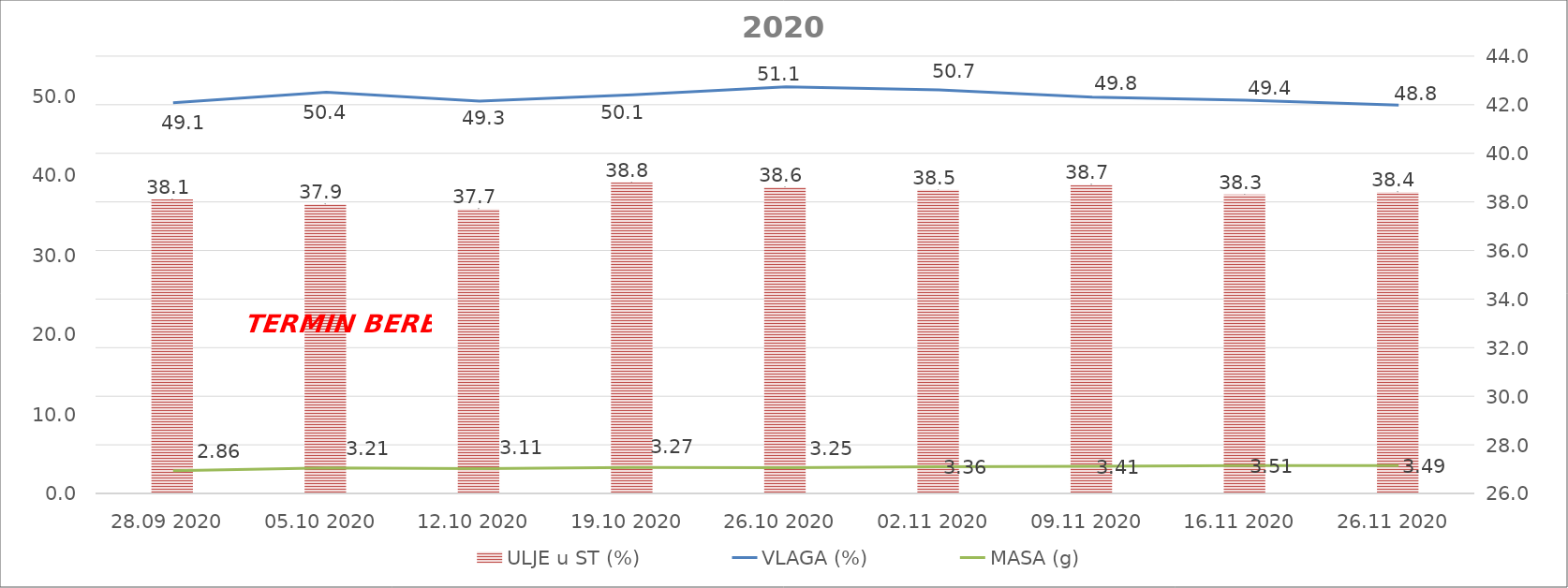
| Category | ULJE u ST (%) |
|---|---|
| 28.09 2020 | 38.1 |
| 05.10 2020 | 37.9 |
| 12.10 2020 | 37.7 |
| 19.10 2020 | 38.8 |
| 26.10 2020 | 38.6 |
| 02.11 2020 | 38.5 |
| 09.11 2020 | 38.7 |
| 16.11 2020 | 38.3 |
| 26.11 2020 | 38.4 |